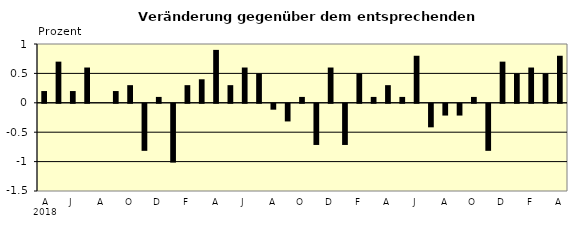
| Category | Series 0 |
|---|---|
| 0 | 0.2 |
| 1 | 0.7 |
| 2 | 0.2 |
| 3 | 0.6 |
| 4 | 0 |
| 5 | 0.2 |
| 6 | 0.3 |
| 7 | -0.8 |
| 8 | 0.1 |
| 9 | -1 |
| 10 | 0.3 |
| 11 | 0.4 |
| 12 | 0.9 |
| 13 | 0.3 |
| 14 | 0.6 |
| 15 | 0.5 |
| 16 | -0.1 |
| 17 | -0.3 |
| 18 | 0.1 |
| 19 | -0.7 |
| 20 | 0.6 |
| 21 | -0.7 |
| 22 | 0.5 |
| 23 | 0.1 |
| 24 | 0.3 |
| 25 | 0.1 |
| 26 | 0.8 |
| 27 | -0.4 |
| 28 | -0.2 |
| 29 | -0.2 |
| 30 | 0.1 |
| 31 | -0.8 |
| 32 | 0.7 |
| 33 | 0.5 |
| 34 | 0.6 |
| 35 | 0.5 |
| 36 | 0.8 |